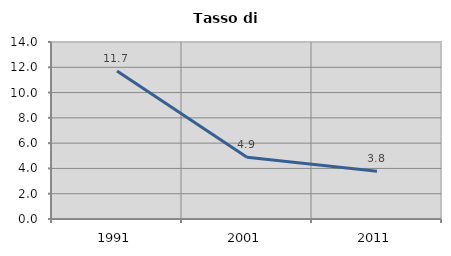
| Category | Tasso di disoccupazione   |
|---|---|
| 1991.0 | 11.705 |
| 2001.0 | 4.884 |
| 2011.0 | 3.783 |